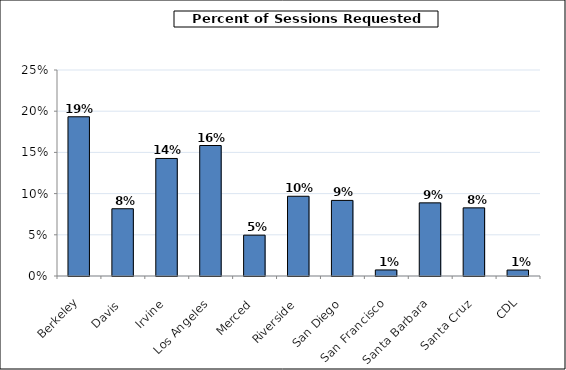
| Category | Sessions requested (by campus) |
|---|---|
| Berkeley | 0.193 |
| Davis | 0.082 |
| Irvine | 0.143 |
| Los Angeles | 0.158 |
| Merced | 0.05 |
| Riverside | 0.097 |
| San Diego | 0.092 |
| San Francisco | 0.007 |
| Santa Barbara | 0.089 |
| Santa Cruz | 0.083 |
| CDL | 0.007 |